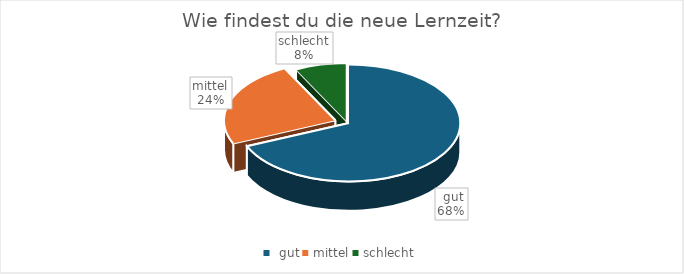
| Category | Series 0 |
|---|---|
|  gut | 100 |
| mittel | 35 |
| schlecht | 11 |